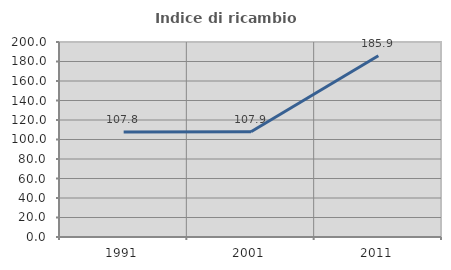
| Category | Indice di ricambio occupazionale  |
|---|---|
| 1991.0 | 107.792 |
| 2001.0 | 107.921 |
| 2011.0 | 185.915 |